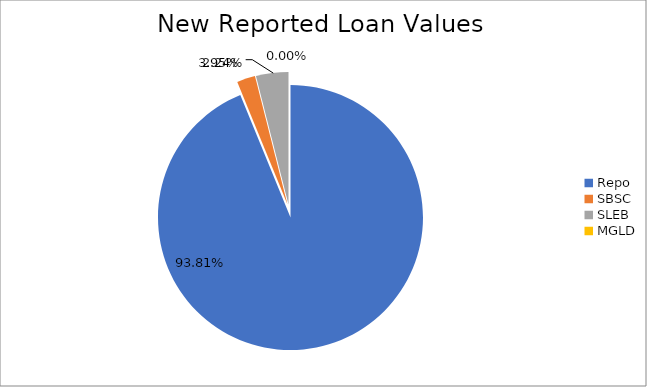
| Category | Series 0 |
|---|---|
| Repo | 8873431.359 |
| SBSC | 211563.184 |
| SLEB | 373350.794 |
| MGLD | 218.807 |